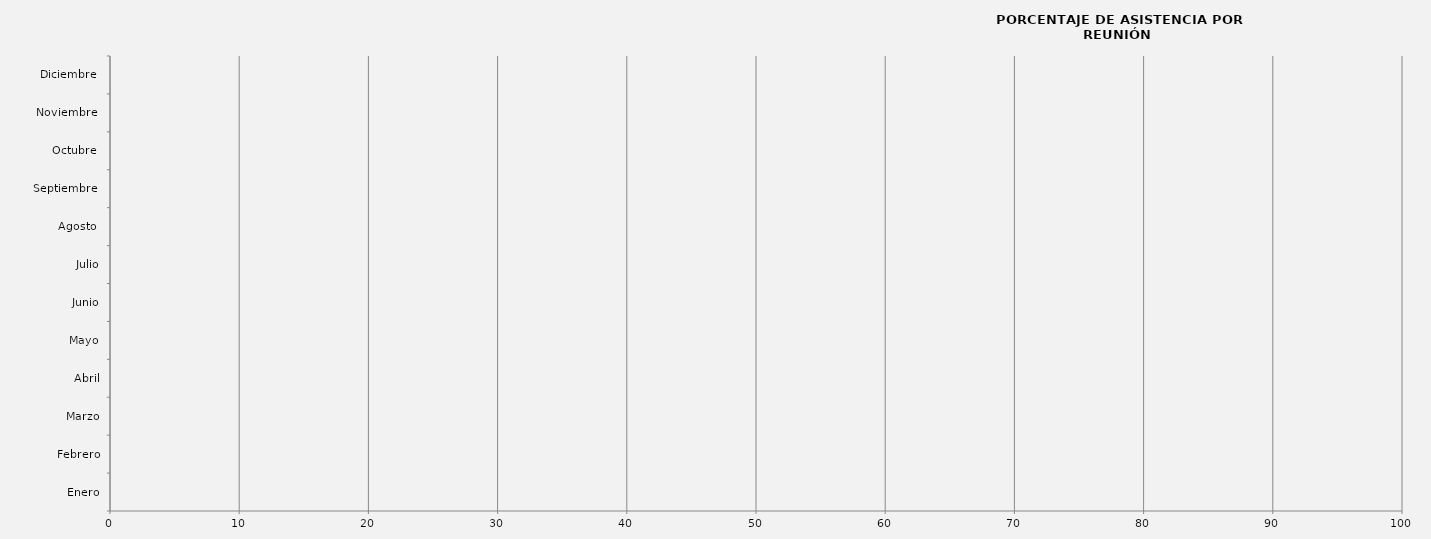
| Category | Series 0 |
|---|---|
| Enero | 0 |
| Febrero | 0 |
| Marzo | 0 |
| Abril | 0 |
| Mayo | 0 |
| Junio | 0 |
| Julio | 0 |
| Agosto  | 0 |
| Septiembre  | 0 |
| Octubre  | 0 |
| Noviembre  | 0 |
| Diciembre  | 0 |